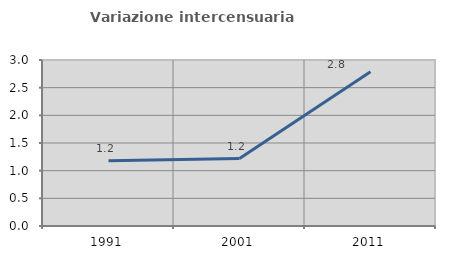
| Category | Variazione intercensuaria annua |
|---|---|
| 1991.0 | 1.178 |
| 2001.0 | 1.219 |
| 2011.0 | 2.786 |